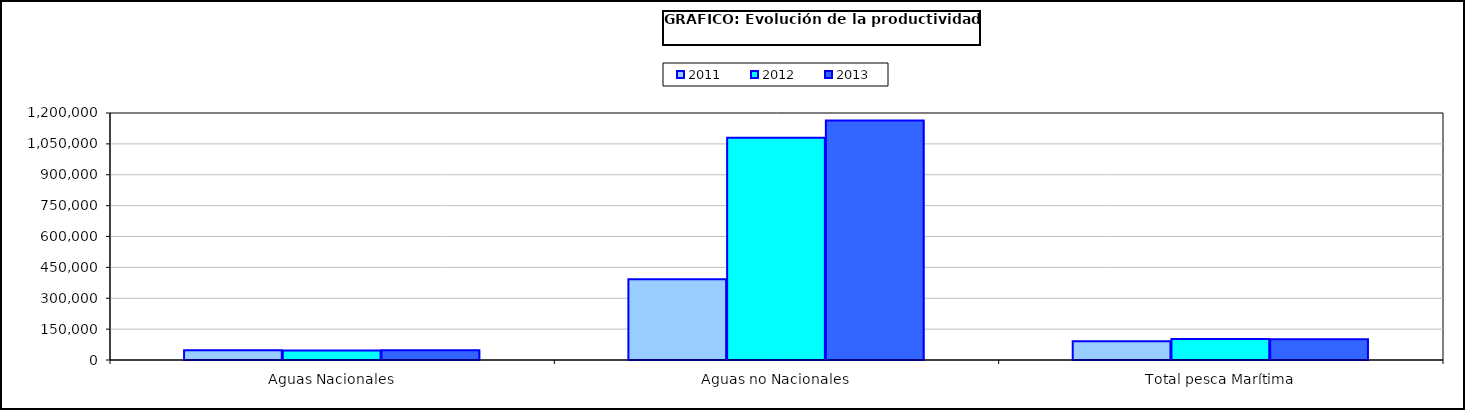
| Category | 2011 | 2012 | 2013 |
|---|---|---|---|
| 0 | 46951.105 | 46383.969 | 47026.449 |
| 1 | 392014.42 | 1079739.644 | 1163471.318 |
| 2 | 91004.712 | 102062.706 | 101103.255 |